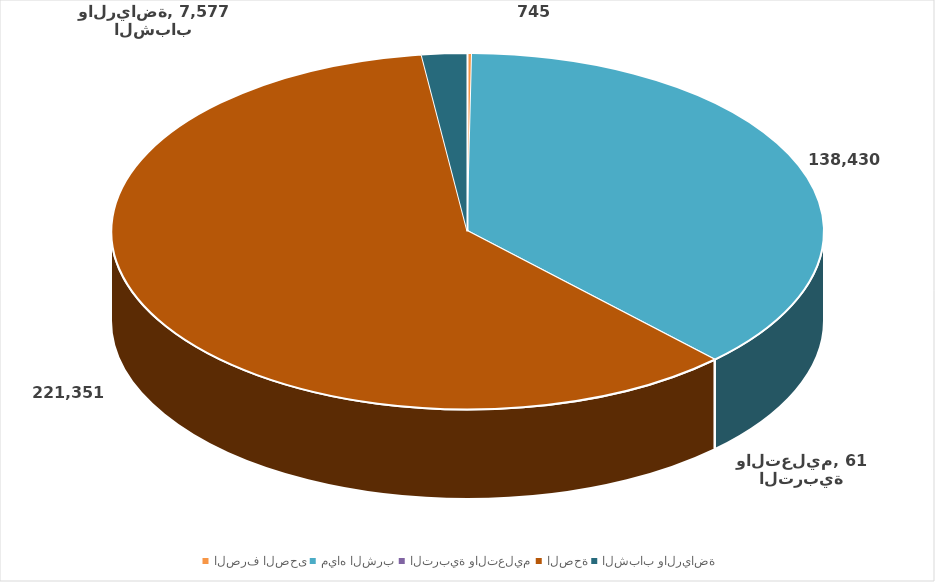
| Category | Series 0 |
|---|---|
| الصرف الصحى | 745 |
| مياه الشرب | 138430 |
| التربية والتعليم | 61 |
| الصحة | 221351 |
| الشباب والرياضة | 7577 |